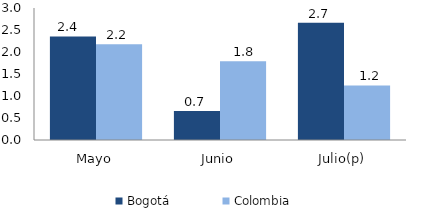
| Category | Bogotá | Colombia |
|---|---|---|
| Mayo | 2.355 | 2.175 |
| Junio | 0.661 | 1.791 |
| Julio(p) | 2.663 | 1.24 |